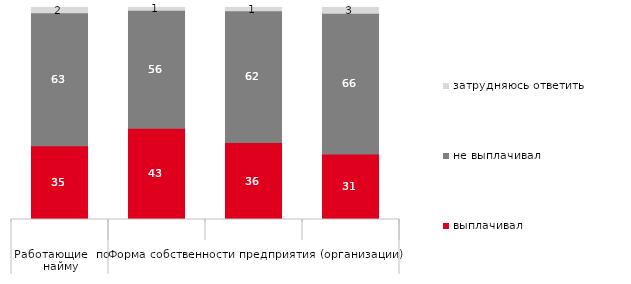
| Category | выплачивал | не выплачивал | затрудняюсь ответить |
|---|---|---|---|
| 0 | 34.766 | 62.751 | 2.483 |
| 1 | 42.994 | 55.732 | 1.274 |
| 2 | 36.296 | 62.222 | 1.481 |
| 3 | 30.93 | 66.414 | 2.657 |